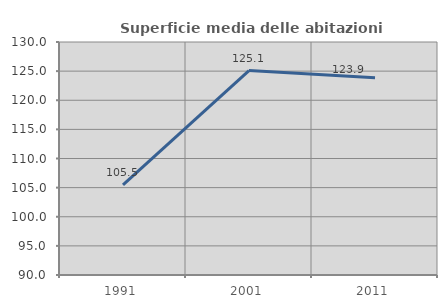
| Category | Superficie media delle abitazioni occupate |
|---|---|
| 1991.0 | 105.456 |
| 2001.0 | 125.088 |
| 2011.0 | 123.85 |